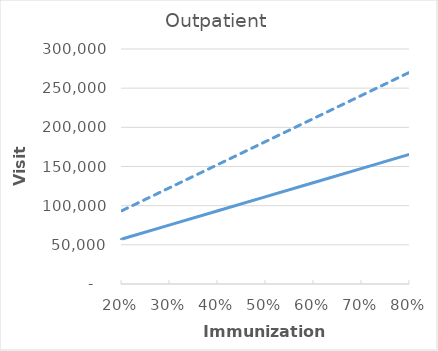
| Category | Low Efficacy, Low RSV Rates | High Efficacy, High RSV Rates |
|---|---|---|
| 0.2 | 57368.653 | 93644.822 |
| 0.30000000000000004 | 75429.286 | 123125.813 |
| 0.4 | 93489.919 | 152606.804 |
| 0.5 | 111550.551 | 182087.795 |
| 0.6 | 129611.184 | 211568.785 |
| 0.7 | 147671.817 | 241049.776 |
| 0.7999999999999999 | 165732.45 | 270530.767 |